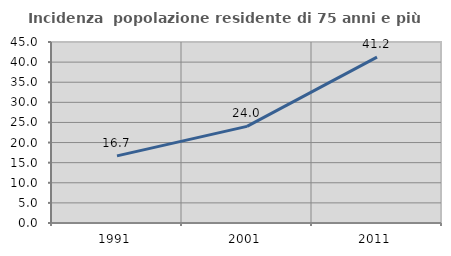
| Category | Incidenza  popolazione residente di 75 anni e più |
|---|---|
| 1991.0 | 16.692 |
| 2001.0 | 24.02 |
| 2011.0 | 41.246 |